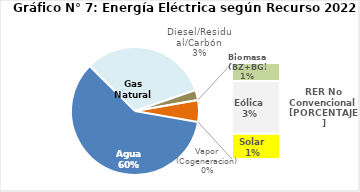
| Category | Series 0 |
|---|---|
| Agua | 2956.383 |
| Gas Natural | 1598.495 |
| Diesel/Residual/Carbón | 125.895 |
| Vapor (Cogeneracion) | 0.245 |
| Biomasa (BZ+BG) | 51.471 |
| Eólica | 150.477 |
| Solar | 71.794 |